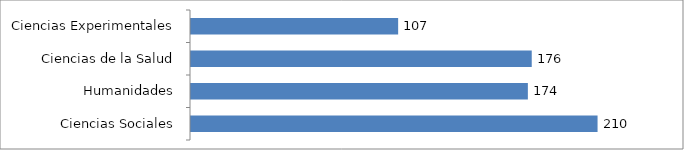
| Category | Series 0 |
|---|---|
| Ciencias Experimentales | 107 |
| Ciencias de la Salud | 176 |
| Humanidades | 174 |
| Ciencias Sociales | 210 |